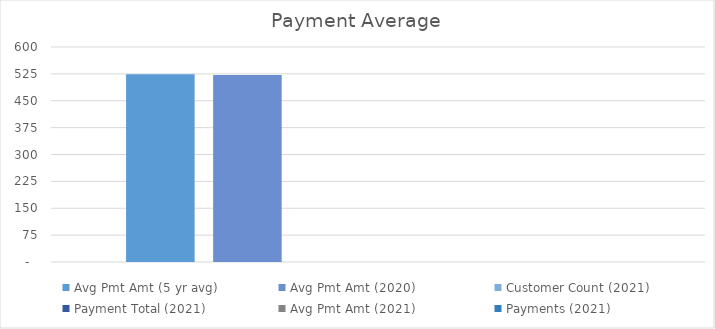
| Category | Avg Pmt Amt (5 yr avg) | Avg Pmt Amt (2020) | Customer Count (2021) | Payment Total (2021) | Avg Pmt Amt (2021) | Payments (2021) |
|---|---|---|---|---|---|---|
| 0 | 523.988 | 521.742 | 0 | 0 | 0 | 0 |